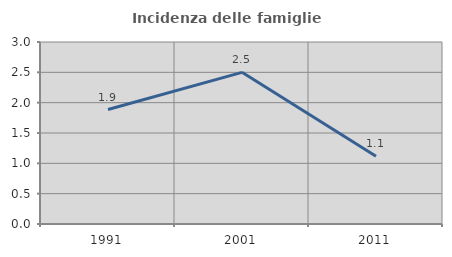
| Category | Incidenza delle famiglie numerose |
|---|---|
| 1991.0 | 1.887 |
| 2001.0 | 2.5 |
| 2011.0 | 1.117 |